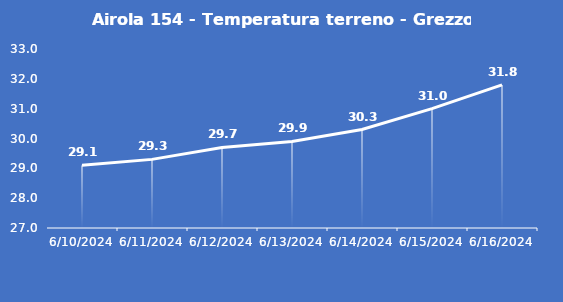
| Category | Airola 154 - Temperatura terreno - Grezzo (°C) |
|---|---|
| 6/10/24 | 29.1 |
| 6/11/24 | 29.3 |
| 6/12/24 | 29.7 |
| 6/13/24 | 29.9 |
| 6/14/24 | 30.3 |
| 6/15/24 | 31 |
| 6/16/24 | 31.8 |